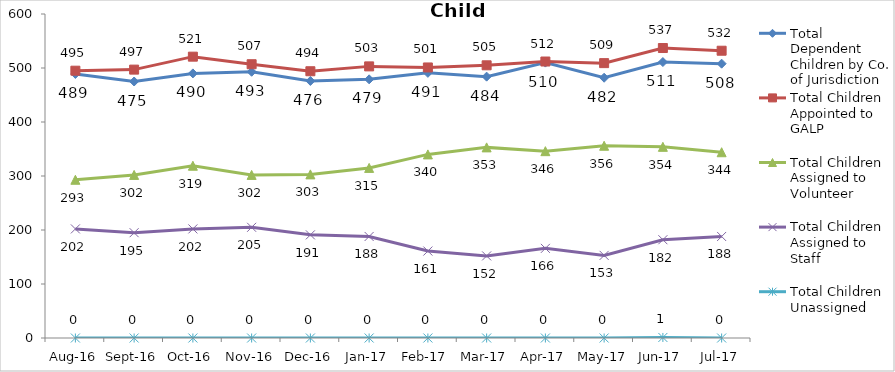
| Category | Total Dependent Children by Co. of Jurisdiction | Total Children Appointed to GALP | Total Children Assigned to Volunteer | Total Children Assigned to Staff | Total Children Unassigned |
|---|---|---|---|---|---|
| Aug-16 | 489 | 495 | 293 | 202 | 0 |
| Sep-16 | 475 | 497 | 302 | 195 | 0 |
| Oct-16 | 490 | 521 | 319 | 202 | 0 |
| Nov-16 | 493 | 507 | 302 | 205 | 0 |
| Dec-16 | 476 | 494 | 303 | 191 | 0 |
| Jan-17 | 479 | 503 | 315 | 188 | 0 |
| Feb-17 | 491 | 501 | 340 | 161 | 0 |
| Mar-17 | 484 | 505 | 353 | 152 | 0 |
| Apr-17 | 510 | 512 | 346 | 166 | 0 |
| May-17 | 482 | 509 | 356 | 153 | 0 |
| Jun-17 | 511 | 537 | 354 | 182 | 1 |
| Jul-17 | 508 | 532 | 344 | 188 | 0 |